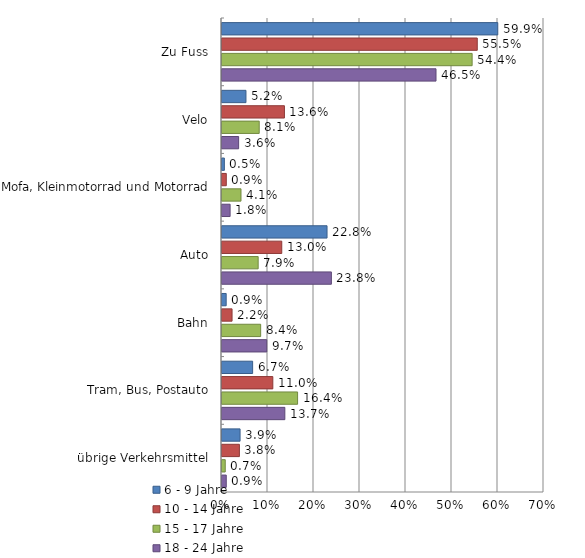
| Category | 6 - 9 Jahre | 10 - 14 Jahre | 15 - 17 Jahre | 18 - 24 Jahre |
|---|---|---|---|---|
| Zu Fuss | 59.949 | 55.491 | 54.377 | 46.523 |
| Velo | 5.208 | 13.57 | 8.091 | 3.617 |
| Mofa, Kleinmotorrad und Motorrad | 0.515 | 0.932 | 4.129 | 1.761 |
| Auto | 22.833 | 12.99 | 7.86 | 23.78 |
| Bahn | 0.907 | 2.186 | 8.407 | 9.731 |
| Tram, Bus, Postauto | 6.661 | 11.049 | 16.431 | 13.661 |
| übrige Verkehrsmittel | 3.927 | 3.783 | 0.705 | 0.927 |